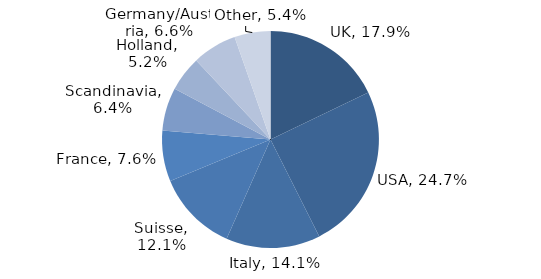
| Category | Investment Style |
|---|---|
| UK | 0.179 |
| USA | 0.247 |
| Italy | 0.141 |
| Suisse | 0.121 |
| France | 0.076 |
| Scandinavia | 0.064 |
| Holland | 0.052 |
| Germany/Austria | 0.066 |
| Other | 0.054 |